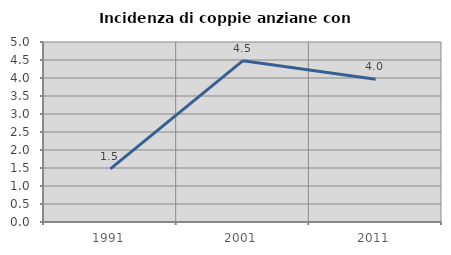
| Category | Incidenza di coppie anziane con figli |
|---|---|
| 1991.0 | 1.474 |
| 2001.0 | 4.482 |
| 2011.0 | 3.963 |